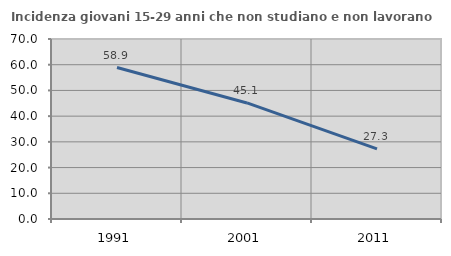
| Category | Incidenza giovani 15-29 anni che non studiano e non lavorano  |
|---|---|
| 1991.0 | 58.901 |
| 2001.0 | 45.133 |
| 2011.0 | 27.273 |